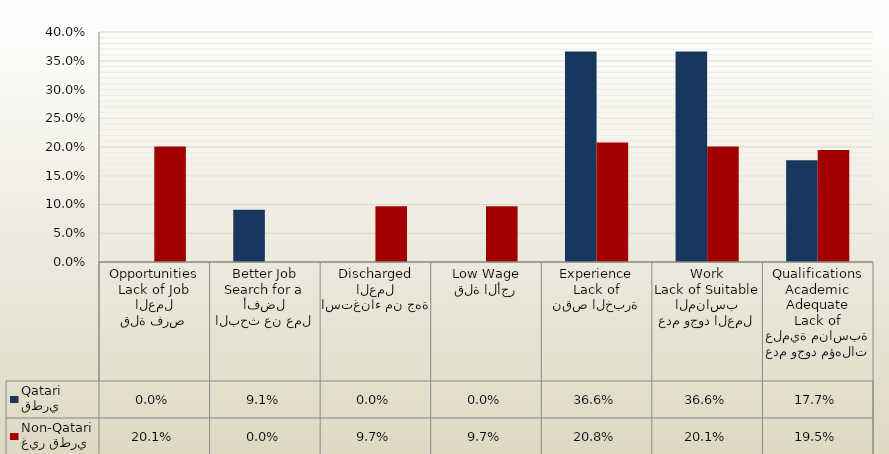
| Category | قطري
Qatari | غير قطري
Non-Qatari |
|---|---|---|
| قلة فرص العمل
Lack of Job Opportunities | 0 | 0.201 |
| البحث عن عمل أفضل
Search for a Better Job | 0.091 | 0 |
| استغناء من جهة العمل
Discharged | 0 | 0.097 |
| قلة الأجر
Low Wage | 0 | 0.097 |
| نقص الخبرة
Lack of Experience | 0.366 | 0.208 |
| عدم وجود العمل المناسب
Lack of Suitable Work | 0.366 | 0.201 |
| عدم وجود مؤهلات علمية مناسبة
Lack of Adequate Academic Qualifications | 0.177 | 0.195 |